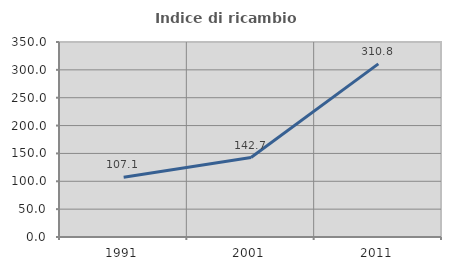
| Category | Indice di ricambio occupazionale  |
|---|---|
| 1991.0 | 107.143 |
| 2001.0 | 142.683 |
| 2011.0 | 310.791 |